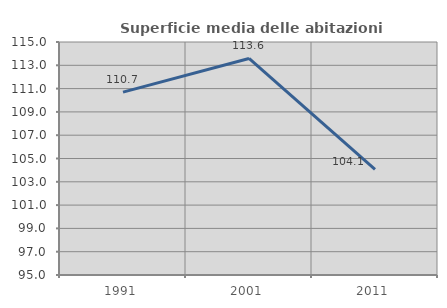
| Category | Superficie media delle abitazioni occupate |
|---|---|
| 1991.0 | 110.696 |
| 2001.0 | 113.586 |
| 2011.0 | 104.066 |